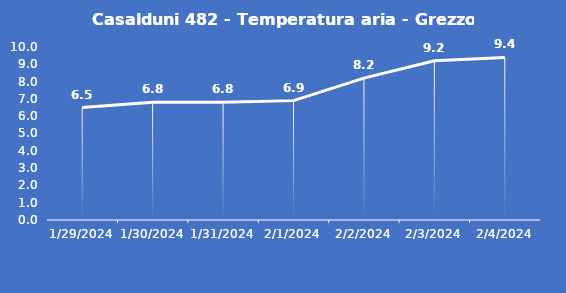
| Category | Casalduni 482 - Temperatura aria - Grezzo (°C) |
|---|---|
| 1/29/24 | 6.5 |
| 1/30/24 | 6.8 |
| 1/31/24 | 6.8 |
| 2/1/24 | 6.9 |
| 2/2/24 | 8.2 |
| 2/3/24 | 9.2 |
| 2/4/24 | 9.4 |